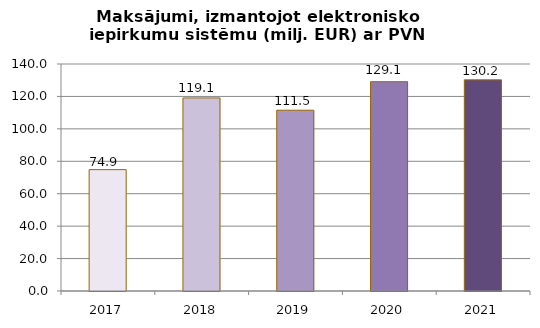
| Category | Maksājumi, izmantojot elektronisko iepirkumu sistēmu (milj. EUR) ar PVN |
|---|---|
| 2017.0 | 74.856 |
| 2018.0 | 119.077 |
| 2019.0 | 111.503 |
| 2020.0 | 129.092 |
| 2021.0 | 130.214 |